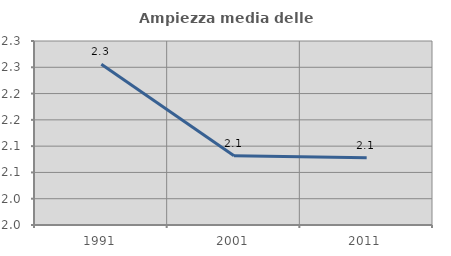
| Category | Ampiezza media delle famiglie |
|---|---|
| 1991.0 | 2.256 |
| 2001.0 | 2.082 |
| 2011.0 | 2.078 |